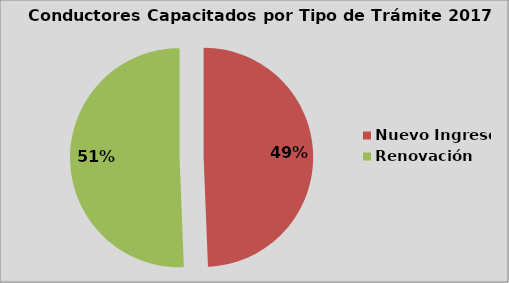
| Category | Series 0 |
|---|---|
| Nuevo Ingreso | 49.37 |
| Renovación | 50.63 |